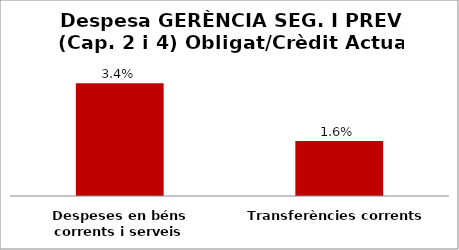
| Category | Series 0 |
|---|---|
| Despeses en béns corrents i serveis | 0.034 |
| Transferències corrents | 0.016 |